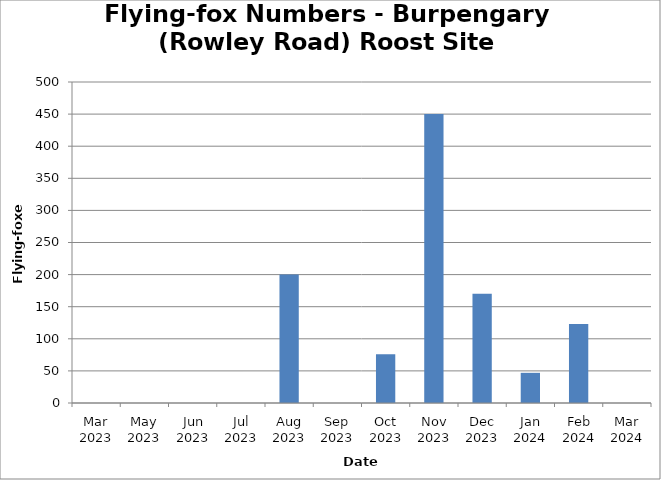
| Category | Flying-foxes |
|---|---|
| Mar 2023 | 0 |
| May 2023 | 0 |
| Jun 2023 | 0 |
| Jul 2023 | 0 |
| Aug 2023 | 200 |
| Sep 2023 | 0 |
| Oct 2023 | 76 |
| Nov 2023 | 450 |
| Dec 2023 | 170 |
| Jan 2024 | 47 |
| Feb 2024 | 123 |
| Mar 2024 | 0 |